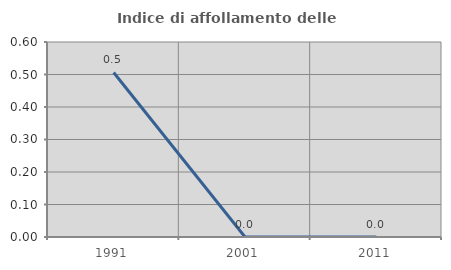
| Category | Indice di affollamento delle abitazioni  |
|---|---|
| 1991.0 | 0.506 |
| 2001.0 | 0 |
| 2011.0 | 0 |